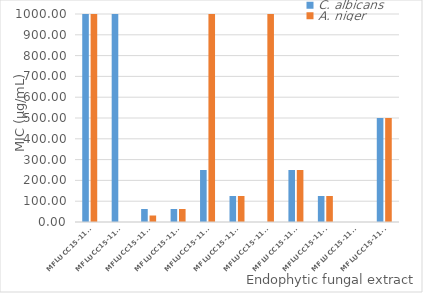
| Category | C. albicans | A. niger |
|---|---|---|
| MFLUCC15-1112 | 1000 | 1000 |
| MFLUCC15-1113 | 1000 | 0 |
| MFLUCC15-1130 | 62.5 | 31.25 |
| MFLUCC15-1131 | 62.5 | 62.5 |
| MFLUCC15-1132 | 250 | 1000 |
| MFLUCC15-1133 | 125 | 125 |
| MFLUCC15-1134 | 0 | 1000 |
| MFLUCC15-1135 | 250 | 250 |
| MFLUCC15-1136 | 125 | 125 |
| MFLUCC15-1137 | 0 | 0 |
| MFLUCC15-1138 | 500 | 500 |